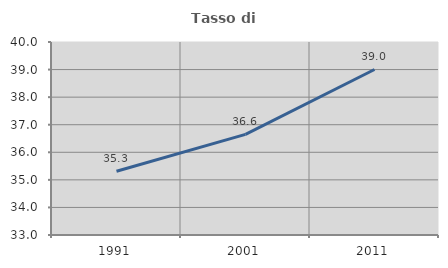
| Category | Tasso di occupazione   |
|---|---|
| 1991.0 | 35.312 |
| 2001.0 | 36.648 |
| 2011.0 | 39.003 |